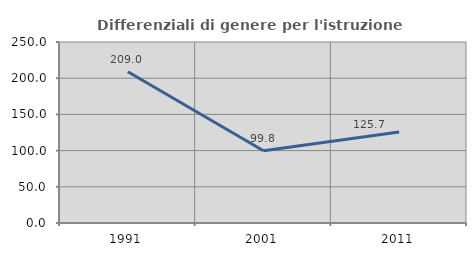
| Category | Differenziali di genere per l'istruzione superiore |
|---|---|
| 1991.0 | 208.984 |
| 2001.0 | 99.764 |
| 2011.0 | 125.735 |